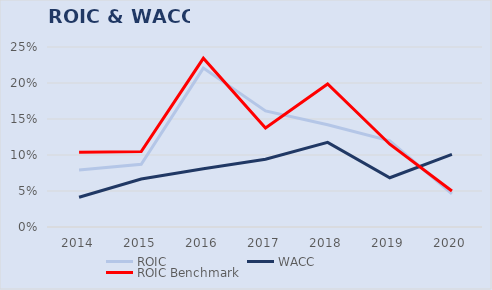
| Category | ROIC | WACC | ROIC Benchmark |
|---|---|---|---|
| 2014.0 | 0.079 | 0.041 | 0.104 |
| 2015.0 | 0.087 | 0.067 | 0.105 |
| 2016.0 | 0.221 | 0.081 | 0.234 |
| 2017.0 | 0.161 | 0.094 | 0.138 |
| 2018.0 | 0.142 | 0.118 | 0.199 |
| 2019.0 | 0.12 | 0.068 | 0.115 |
| 2020.0 | 0.046 | 0.101 | 0.05 |